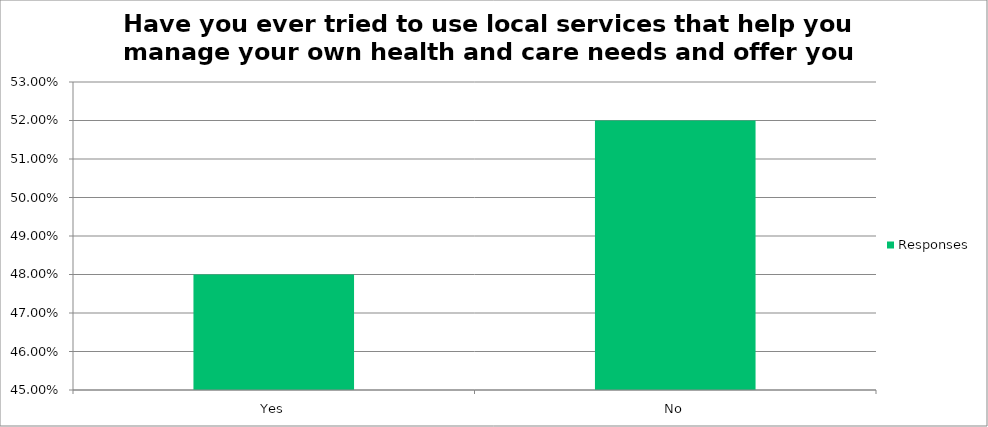
| Category | Responses |
|---|---|
| Yes | 0.48 |
| No | 0.52 |